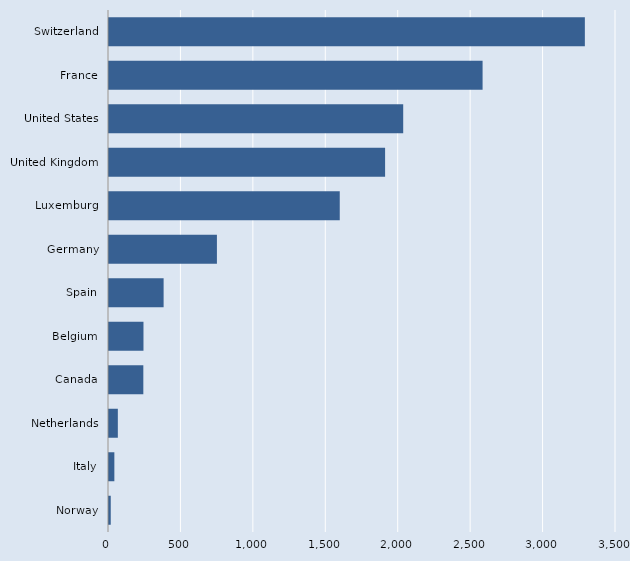
| Category | Series 0 |
|---|---|
| Norway | 12 |
| Italy | 37 |
| Netherlands | 61 |
| Canada | 237 |
| Belgium | 238 |
| Spain | 377 |
| Germany | 745 |
| Luxemburg | 1593 |
| United Kingdom | 1906 |
| United States | 2031 |
| France | 2579 |
| Switzerland | 3285 |